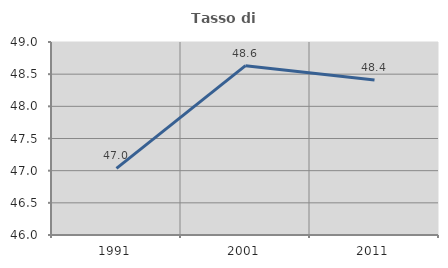
| Category | Tasso di occupazione   |
|---|---|
| 1991.0 | 47.036 |
| 2001.0 | 48.632 |
| 2011.0 | 48.41 |